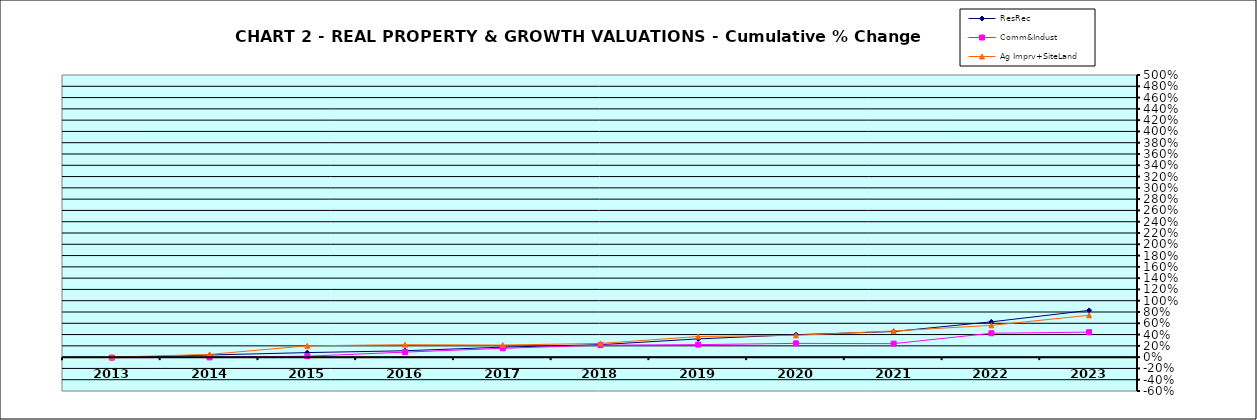
| Category | ResRec | Comm&Indust | Ag Imprv+SiteLand |
|---|---|---|---|
| 2013.0 | -0.011 | -0.009 | 0 |
| 2014.0 | 0.038 | -0.005 | 0.048 |
| 2015.0 | 0.08 | 0.017 | 0.201 |
| 2016.0 | 0.113 | 0.089 | 0.22 |
| 2017.0 | 0.177 | 0.157 | 0.214 |
| 2018.0 | 0.221 | 0.212 | 0.243 |
| 2019.0 | 0.323 | 0.222 | 0.365 |
| 2020.0 | 0.398 | 0.244 | 0.386 |
| 2021.0 | 0.454 | 0.239 | 0.464 |
| 2022.0 | 0.626 | 0.423 | 0.563 |
| 2023.0 | 0.829 | 0.443 | 0.742 |